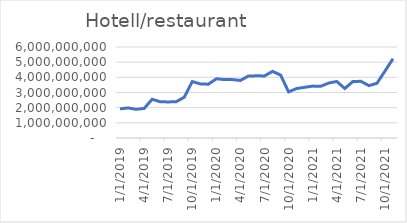
| Category | Hotell/restaurant |
|---|---|
| 1/1/19 | 1916458333.333 |
| 2/1/19 | 1983579166.667 |
| 3/1/19 | 1892150000 |
| 4/1/19 | 1946558333.333 |
| 5/1/19 | 2553079166.667 |
| 6/1/19 | 2392825000 |
| 7/1/19 | 2377283333.333 |
| 8/1/19 | 2393725000 |
| 9/1/19 | 2688191666.667 |
| 10/1/19 | 3721825000 |
| 11/1/19 | 3565558333.333 |
| 12/1/19 | 3547350000 |
| 1/1/20 | 3905108333.333 |
| 2/1/20 | 3854525000 |
| 3/1/20 | 3851054166.667 |
| 4/1/20 | 3794112500 |
| 5/1/20 | 4090695833.333 |
| 6/1/20 | 4097666666.667 |
| 7/1/20 | 4095083333.333 |
| 8/1/20 | 4393100000 |
| 9/1/20 | 4150308333.333 |
| 10/1/20 | 3040291666.667 |
| 11/1/20 | 3261525000 |
| 12/1/20 | 3343233333.333 |
| 1/1/21 | 3421495833.333 |
| 2/1/21 | 3411245833.333 |
| 3/1/21 | 3623133333.333 |
| 4/1/21 | 3728443333.333 |
| 5/1/21 | 3263985000 |
| 6/1/21 | 3723868333.333 |
| 7/1/21 | 3736643333.333 |
| 8/1/21 | 3454951666.667 |
| 9/1/21 | 3605826666.667 |
| 10/1/21 | 4409935000 |
| 11/1/21 | 5227426666.667 |